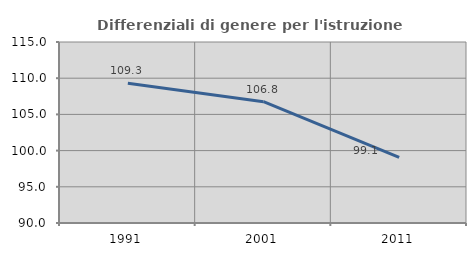
| Category | Differenziali di genere per l'istruzione superiore |
|---|---|
| 1991.0 | 109.289 |
| 2001.0 | 106.752 |
| 2011.0 | 99.055 |